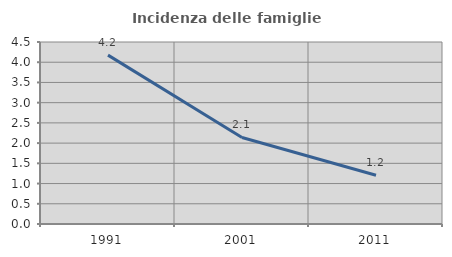
| Category | Incidenza delle famiglie numerose |
|---|---|
| 1991.0 | 4.176 |
| 2001.0 | 2.139 |
| 2011.0 | 1.206 |